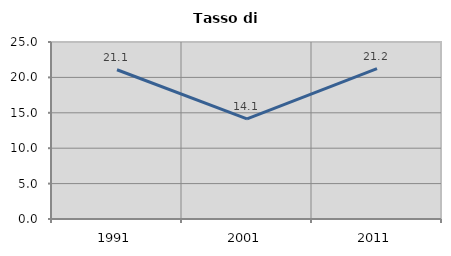
| Category | Tasso di disoccupazione   |
|---|---|
| 1991.0 | 21.081 |
| 2001.0 | 14.141 |
| 2011.0 | 21.239 |